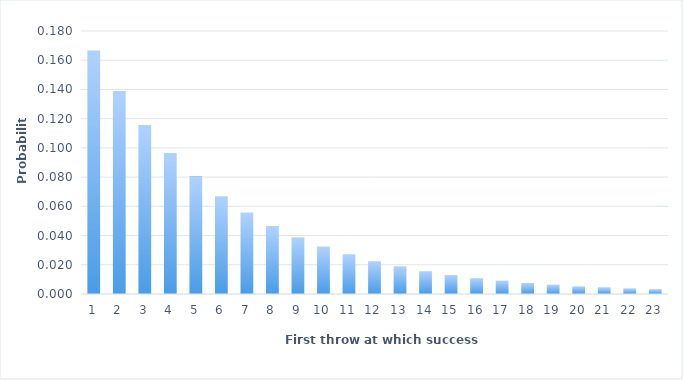
| Category | Series 0 |
|---|---|
| 0 | 0.167 |
| 1 | 0.139 |
| 2 | 0.116 |
| 3 | 0.096 |
| 4 | 0.08 |
| 5 | 0.067 |
| 6 | 0.056 |
| 7 | 0.047 |
| 8 | 0.039 |
| 9 | 0.032 |
| 10 | 0.027 |
| 11 | 0.022 |
| 12 | 0.019 |
| 13 | 0.016 |
| 14 | 0.013 |
| 15 | 0.011 |
| 16 | 0.009 |
| 17 | 0.008 |
| 18 | 0.006 |
| 19 | 0.005 |
| 20 | 0.004 |
| 21 | 0.004 |
| 22 | 0.003 |